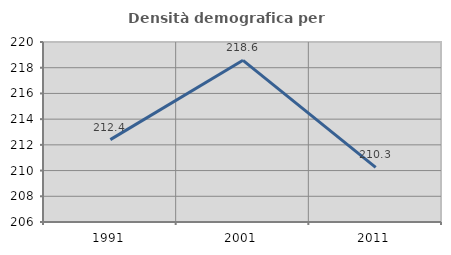
| Category | Densità demografica |
|---|---|
| 1991.0 | 212.406 |
| 2001.0 | 218.577 |
| 2011.0 | 210.252 |